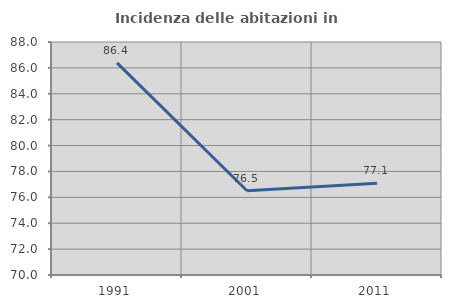
| Category | Incidenza delle abitazioni in proprietà  |
|---|---|
| 1991.0 | 86.391 |
| 2001.0 | 76.506 |
| 2011.0 | 77.083 |